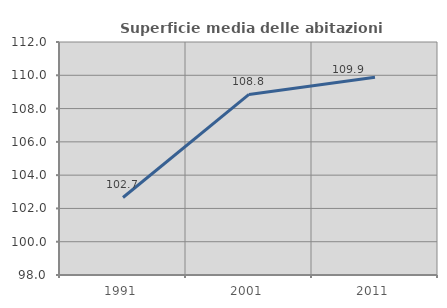
| Category | Superficie media delle abitazioni occupate |
|---|---|
| 1991.0 | 102.659 |
| 2001.0 | 108.848 |
| 2011.0 | 109.879 |